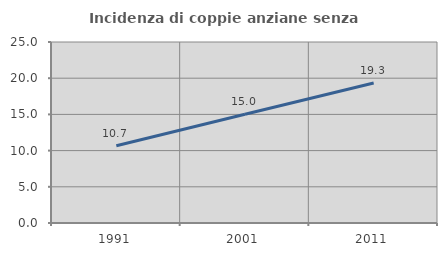
| Category | Incidenza di coppie anziane senza figli  |
|---|---|
| 1991.0 | 10.661 |
| 2001.0 | 15.029 |
| 2011.0 | 19.338 |